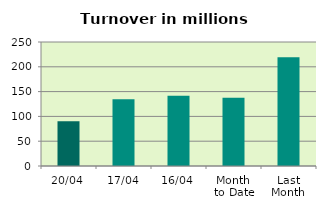
| Category | Series 0 |
|---|---|
| 20/04 | 90.32 |
| 17/04 | 134.484 |
| 16/04 | 141.719 |
| Month 
to Date | 137.379 |
| Last
Month | 219.362 |